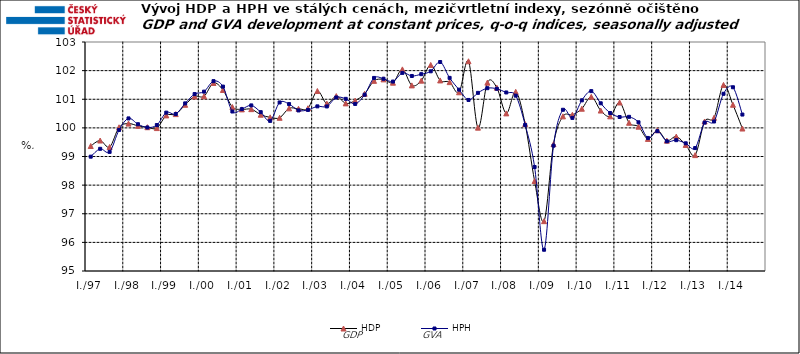
| Category | HDP

 | HPH

 |
|---|---|---|
| I./97 | 99.366 | 98.994 |
|  | 99.558 | 99.268 |
|  | 99.332 | 99.162 |
|  | 100.02 | 99.926 |
| I./98 | 100.15 | 100.331 |
|  | 100.071 | 100.128 |
|  | 100.023 | 100.014 |
|  | 99.993 | 100.098 |
| I./99 | 100.436 | 100.533 |
|  | 100.481 | 100.485 |
|  | 100.806 | 100.856 |
|  | 101.098 | 101.181 |
| I./00 | 101.105 | 101.266 |
|  | 101.569 | 101.633 |
|  | 101.324 | 101.442 |
|  | 100.728 | 100.572 |
| I./01 | 100.646 | 100.656 |
|  | 100.654 | 100.785 |
|  | 100.46 | 100.549 |
|  | 100.368 | 100.244 |
| I./02 | 100.352 | 100.888 |
|  | 100.682 | 100.832 |
|  | 100.668 | 100.61 |
|  | 100.686 | 100.628 |
| I./03 | 101.287 | 100.751 |
|  | 100.846 | 100.749 |
|  | 101.111 | 101.063 |
|  | 100.856 | 101.014 |
| I./04 | 100.953 | 100.836 |
|  | 101.19 | 101.159 |
|  | 101.643 | 101.745 |
|  | 101.695 | 101.716 |
| I./05 | 101.579 | 101.618 |
|  | 102.043 | 101.921 |
|  | 101.484 | 101.813 |
|  | 101.65 | 101.876 |
| I./06 | 102.198 | 101.976 |
|  | 101.658 | 102.301 |
|  | 101.598 | 101.747 |
|  | 101.244 | 101.335 |
| I./07 | 102.327 | 100.976 |
|  | 100.008 | 101.223 |
|  | 101.581 | 101.387 |
|  | 101.404 | 101.366 |
| I./08 | 100.506 | 101.237 |
|  | 101.26 | 101.126 |
|  | 100.132 | 100.103 |
|  | 98.143 | 98.633 |
| I./09 | 96.742 | 95.743 |
|  | 99.431 | 99.379 |
|  | 100.403 | 100.632 |
|  | 100.457 | 100.348 |
| I./10 | 100.669 | 100.962 |
|  | 101.085 | 101.283 |
|  | 100.605 | 100.859 |
|  | 100.403 | 100.52 |
| I./11 | 100.886 | 100.379 |
|  | 100.178 | 100.386 |
|  | 100.042 | 100.195 |
|  | 99.615 | 99.648 |
| I./12 | 99.917 | 99.886 |
|  | 99.553 | 99.532 |
|  | 99.696 | 99.57 |
|  | 99.405 | 99.461 |
| I./13 | 99.049 | 99.295 |
|  | 100.223 | 100.185 |
|  | 100.353 | 100.223 |
|  | 101.501 | 101.191 |
| I./14 | 100.808 | 101.419 |